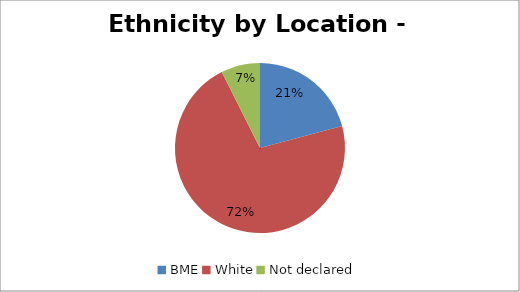
| Category | Series 0 |
|---|---|
| BME | 264 |
| White | 908 |
| Not declared | 94 |